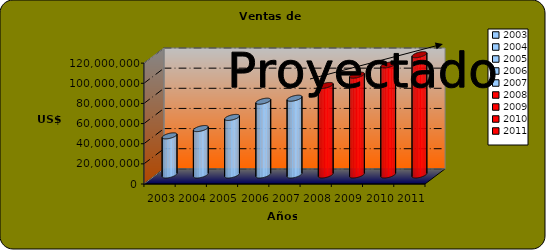
| Category | Ventas |
|---|---|
| 2003.0 | 38863949 |
| 2004.0 | 46102914 |
| 2005.0 | 57160945 |
| 2006.0 | 73268149 |
| 2007.0 | 76233000 |
| 2008.0 | 88896792.5 |
| 2009.0 | 99087126.2 |
| 2010.0 | 109277459.9 |
| 2011.0 | 119467793.6 |